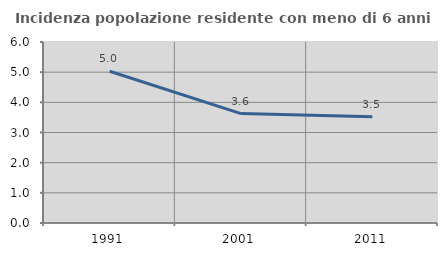
| Category | Incidenza popolazione residente con meno di 6 anni |
|---|---|
| 1991.0 | 5.031 |
| 2001.0 | 3.627 |
| 2011.0 | 3.524 |